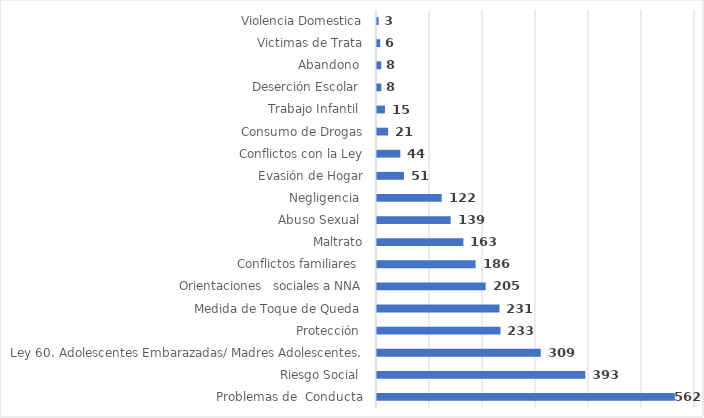
| Category | Series 0 |
|---|---|
| Problemas de  Conducta | 562 |
| Riesgo Social  | 393 |
| Ley 60. Adolescentes Embarazadas/ Madres Adolescentes. | 309 |
| Protección  | 233 |
| Medida de Toque de Queda  | 231 |
| Orientaciones   sociales a NNA | 205 |
| Conflictos familiares  | 186 |
| Maltrato | 163 |
| Abuso Sexual  | 139 |
| Negligencia  | 122 |
| Evasión de Hogar | 51 |
| Conflictos con la Ley | 44 |
| Consumo de Drogas | 21 |
| Trabajo Infantil  | 15 |
| Deserción Escolar  | 8 |
| Abandono  | 8 |
| Victimas de Trata | 6 |
| Violencia Domestica | 3 |